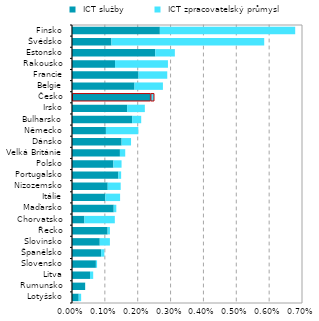
| Category |  ICT služby |  ICT zpracovatelský průmysl |
|---|---|---|
| Lotyšsko | 0 | 0 |
| Rumunsko | 0 | 0 |
| Litva | 0.001 | 0 |
| Slovensko | 0.001 | 0 |
| Španělsko | 0.001 | 0 |
| Slovinsko | 0.001 | 0 |
| Řecko | 0.001 | 0 |
| Chorvatsko | 0 | 0.001 |
| Maďarsko | 0.001 | 0 |
| Itálie | 0.001 | 0 |
| Nizozemsko | 0.001 | 0 |
| Portugalsko | 0.001 | 0 |
| Polsko | 0.001 | 0 |
| Velká Británie | 0.001 | 0 |
| Dánsko | 0.002 | 0 |
| Německo | 0.001 | 0.001 |
| Bulharsko | 0.002 | 0 |
| Irsko | 0.002 | 0.001 |
| Česko | 0.002 | 0 |
| Belgie | 0.002 | 0.001 |
| Francie | 0.002 | 0.001 |
| Rakousko | 0.001 | 0.002 |
| Estonsko | 0.003 | 0.001 |
| Švédsko | 0.001 | 0.005 |
| Finsko | 0.003 | 0.004 |